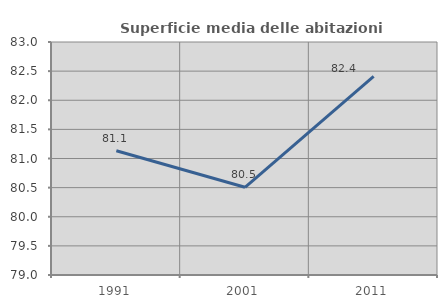
| Category | Superficie media delle abitazioni occupate |
|---|---|
| 1991.0 | 81.134 |
| 2001.0 | 80.505 |
| 2011.0 | 82.411 |